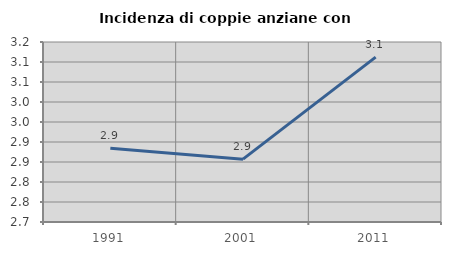
| Category | Incidenza di coppie anziane con figli |
|---|---|
| 1991.0 | 2.885 |
| 2001.0 | 2.857 |
| 2011.0 | 3.112 |